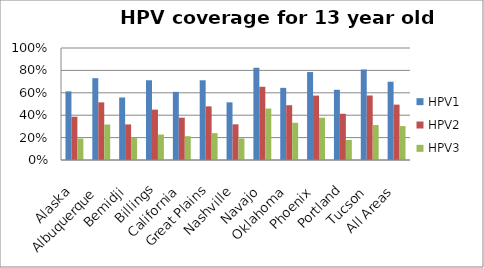
| Category | HPV1  | HPV2  | HPV3  |
|---|---|---|---|
| Alaska | 0.613 | 0.386 | 0.191 |
| Albuquerque | 0.73 | 0.515 | 0.317 |
| Bemidji | 0.558 | 0.318 | 0.199 |
| Billings | 0.712 | 0.45 | 0.227 |
| California | 0.609 | 0.378 | 0.213 |
| Great Plains | 0.712 | 0.479 | 0.239 |
| Nashville | 0.515 | 0.319 | 0.193 |
| Navajo | 0.824 | 0.654 | 0.46 |
| Oklahoma | 0.644 | 0.489 | 0.332 |
| Phoenix | 0.785 | 0.575 | 0.378 |
| Portland | 0.627 | 0.413 | 0.179 |
| Tucson | 0.808 | 0.576 | 0.312 |
| All Areas | 0.699 | 0.494 | 0.303 |